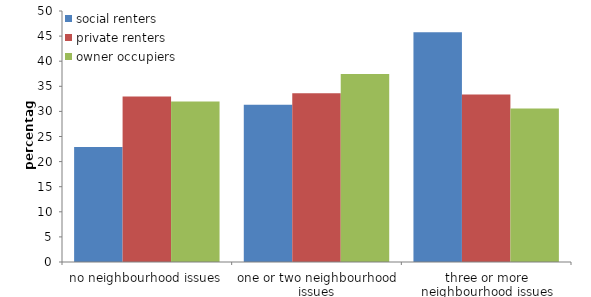
| Category | social renters | private renters | owner occupiers |
|---|---|---|---|
| no neighbourhood issues | 22.923 | 32.986 | 31.996 |
| one or two neighbourhood issues | 31.332 | 33.637 | 37.427 |
| three or more neighbourhood issues | 45.745 | 33.377 | 30.577 |